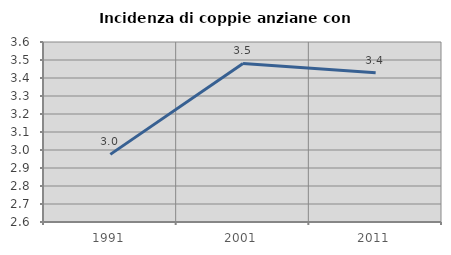
| Category | Incidenza di coppie anziane con figli |
|---|---|
| 1991.0 | 2.976 |
| 2001.0 | 3.481 |
| 2011.0 | 3.429 |